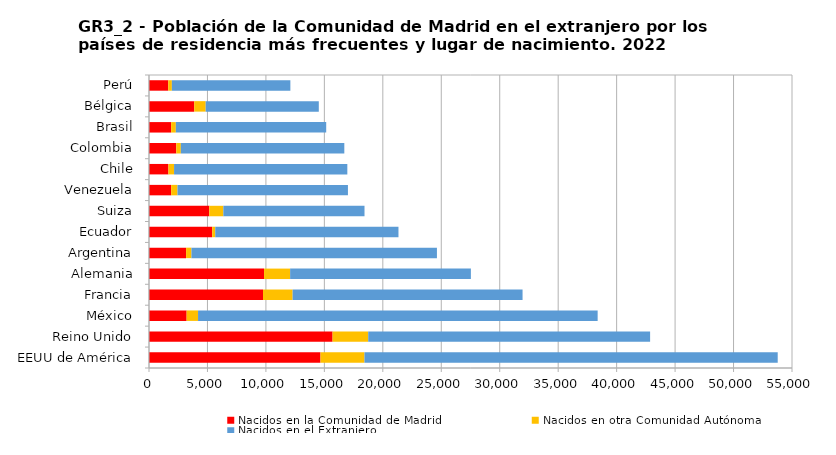
| Category | Nacidos en la Comunidad de Madrid | Nacidos en otra Comunidad Autónoma | Nacidos en el Extranjero |
|---|---|---|---|
|     EEUU de América | 14669 | 3760 | 35349 |
|     Reino Unido | 15702 | 3048 | 24113 |
|     México | 3219 | 976 | 34181 |
|     Francia | 9752 | 2533 | 19668 |
|     Alemania | 9840 | 2232 | 15461 |
|     Argentina | 3173 | 457 | 20999 |
|     Ecuador | 5407 | 259 | 15673 |
|     Suiza | 5156 | 1204 | 12074 |
|     Venezuela | 1896 | 540 | 14581 |
|     Chile | 1662 | 483 | 14819 |
|     Colombia | 2336 | 387 | 13984 |
|     Brasil | 1894 | 401 | 12863 |
|     Bélgica | 3869 | 979 | 9676 |
|     Perú | 1646 | 309 | 10137 |